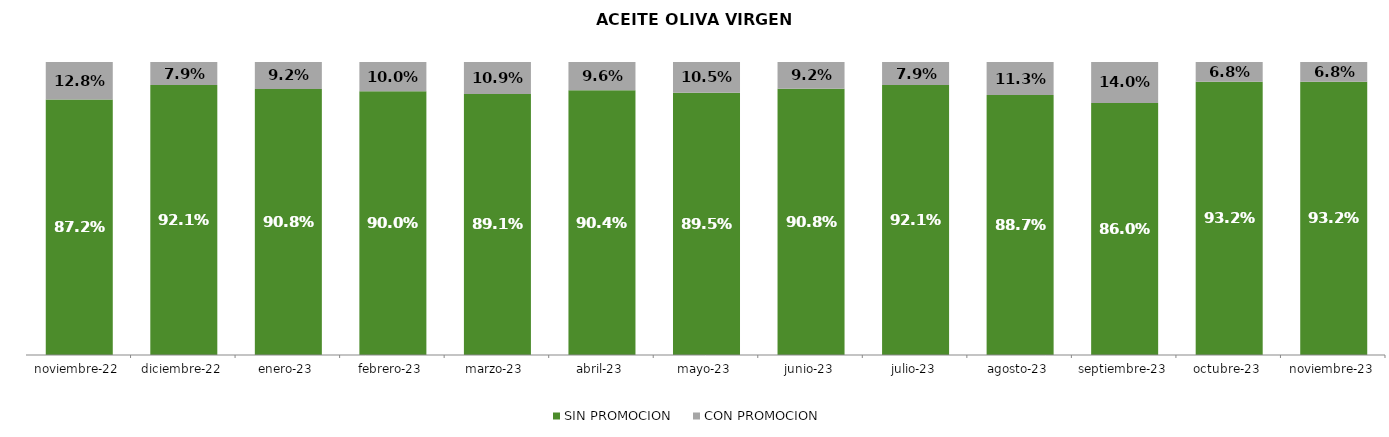
| Category | SIN PROMOCION   | CON PROMOCION   |
|---|---|---|
| 2022-11-01 | 0.872 | 0.128 |
| 2022-12-01 | 0.921 | 0.079 |
| 2023-01-01 | 0.908 | 0.092 |
| 2023-02-01 | 0.9 | 0.1 |
| 2023-03-01 | 0.891 | 0.109 |
| 2023-04-01 | 0.904 | 0.096 |
| 2023-05-01 | 0.895 | 0.105 |
| 2023-06-01 | 0.908 | 0.092 |
| 2023-07-01 | 0.921 | 0.079 |
| 2023-08-01 | 0.887 | 0.113 |
| 2023-09-01 | 0.86 | 0.14 |
| 2023-10-01 | 0.932 | 0.068 |
| 2023-11-01 | 0.932 | 0.068 |